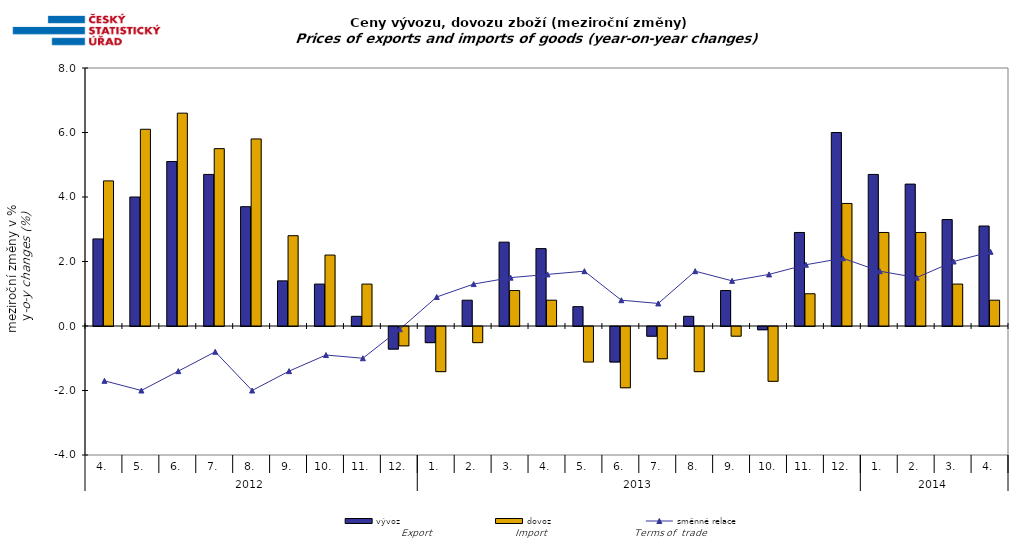
| Category | vývoz | dovoz |
|---|---|---|
| 0 | 2.7 | 4.5 |
| 1 | 4 | 6.1 |
| 2 | 5.1 | 6.6 |
| 3 | 4.7 | 5.5 |
| 4 | 3.7 | 5.8 |
| 5 | 1.4 | 2.8 |
| 6 | 1.3 | 2.2 |
| 7 | 0.3 | 1.3 |
| 8 | -0.7 | -0.6 |
| 9 | -0.5 | -1.4 |
| 10 | 0.8 | -0.5 |
| 11 | 2.6 | 1.1 |
| 12 | 2.4 | 0.8 |
| 13 | 0.6 | -1.1 |
| 14 | -1.1 | -1.9 |
| 15 | -0.3 | -1 |
| 16 | 0.3 | -1.4 |
| 17 | 1.1 | -0.3 |
| 18 | -0.1 | -1.7 |
| 19 | 2.9 | 1 |
| 20 | 6 | 3.8 |
| 21 | 4.7 | 2.9 |
| 22 | 4.4 | 2.9 |
| 23 | 3.3 | 1.3 |
| 24 | 3.1 | 0.8 |